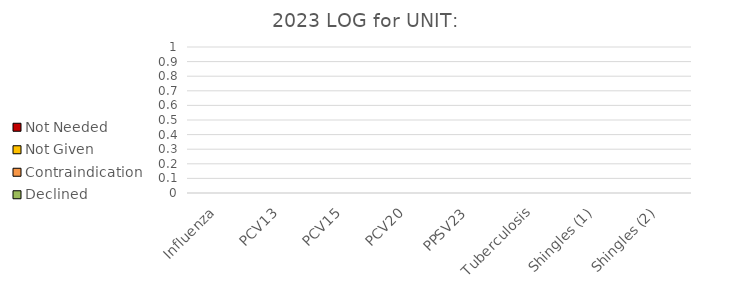
| Category | Declined | Contraindication | Not Given | Not Needed |
|---|---|---|---|---|
| Influenza | 0 | 0 | 0 | 0 |
| PCV13 | 0 | 0 | 0 | 0 |
| PCV15 | 0 | 0 | 0 | 0 |
| PCV20 | 0 | 0 | 0 | 0 |
| PPSV23 | 0 | 0 | 0 | 0 |
| Tuberculosis | 0 | 0 | 0 | 0 |
| Shingles (1) | 0 | 0 | 0 | 0 |
| Shingles (2) | 0 | 0 | 0 | 0 |